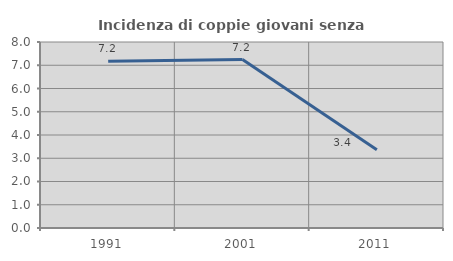
| Category | Incidenza di coppie giovani senza figli |
|---|---|
| 1991.0 | 7.176 |
| 2001.0 | 7.245 |
| 2011.0 | 3.366 |